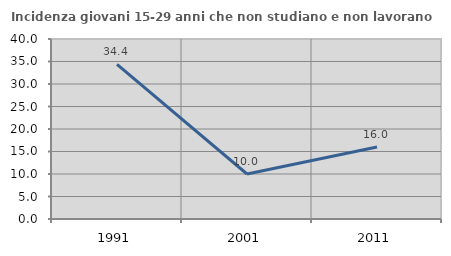
| Category | Incidenza giovani 15-29 anni che non studiano e non lavorano  |
|---|---|
| 1991.0 | 34.358 |
| 2001.0 | 10 |
| 2011.0 | 15.984 |